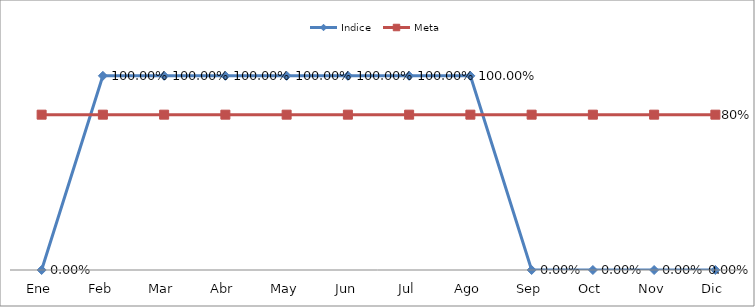
| Category | Indice | Meta |
|---|---|---|
| Ene | 0 | 0.8 |
| Feb | 1 | 0.8 |
| Mar | 1 | 0.8 |
| Abr | 1 | 0.8 |
| May | 1 | 0.8 |
| Jun | 1 | 0.8 |
| Jul | 1 | 0.8 |
| Ago | 1 | 0.8 |
| Sep | 0 | 0.8 |
| Oct | 0 | 0.8 |
| Nov | 0 | 0.8 |
| Dic | 0 | 0.8 |